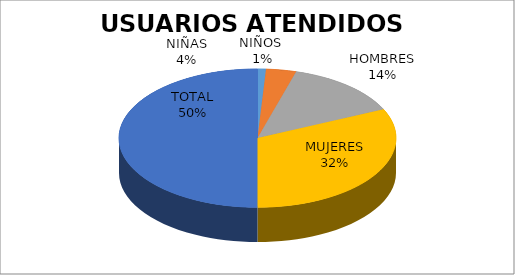
| Category | USUARIOS ATENDIDOS  PORCENTAJE | USUARIOS ATENDIDOS  CANTIDAD |
|---|---|---|
| NIÑOS  | 1.953 | 5 |
| NIÑAS | 7.031 | 18 |
| HOMBRES | 27.344 | 70 |
| MUJERES | 63.672 | 163 |
| TOTAL | 100 | 256 |